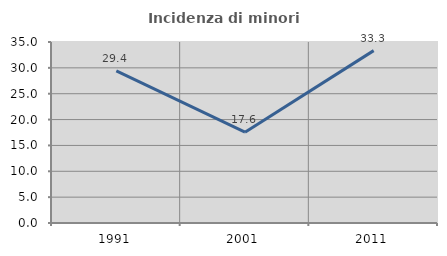
| Category | Incidenza di minori stranieri |
|---|---|
| 1991.0 | 29.412 |
| 2001.0 | 17.568 |
| 2011.0 | 33.333 |